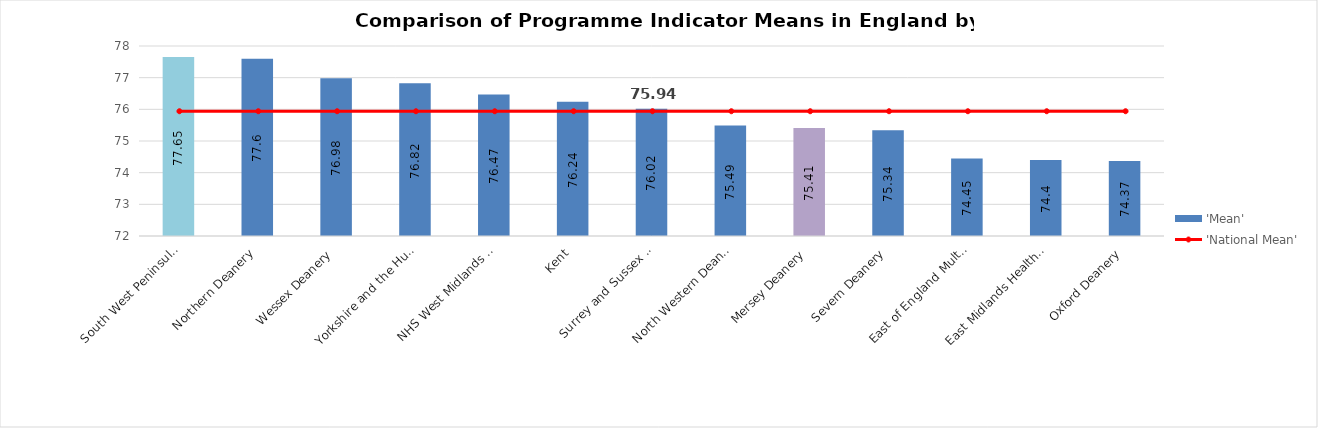
| Category | 'Mean' |
|---|---|
| South West Peninsula Deanery | 77.65 |
| Northern Deanery | 77.6 |
| Wessex Deanery | 76.98 |
| Yorkshire and the Humber Postgraduate Deanery | 76.82 |
| NHS West Midlands Workforce Deanery | 76.47 |
| Kent, Surrey and Sussex Deanery | 76.24 |
| North Western Deanery | 76.02 |
| Mersey Deanery | 75.49 |
| Severn Deanery | 75.41 |
| East of England Multi-Professional Deanery | 75.34 |
| East Midlands Healthcare Workforce Deanery | 74.45 |
| Oxford Deanery | 74.4 |
| London Deanery | 74.37 |